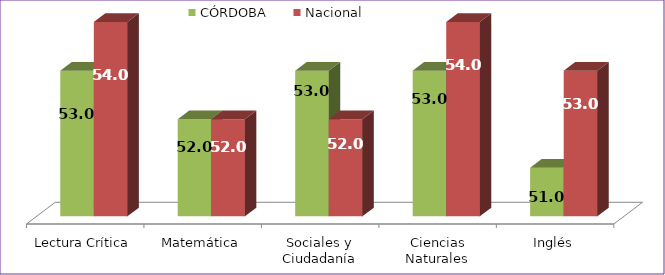
| Category | CÓRDOBA | Nacional |
|---|---|---|
| Lectura Crítica | 53 | 54 |
| Matemática | 52 | 52 |
| Sociales y Ciudadanía | 53 | 52 |
| Ciencias Naturales | 53 | 54 |
| Inglés | 51 | 53 |